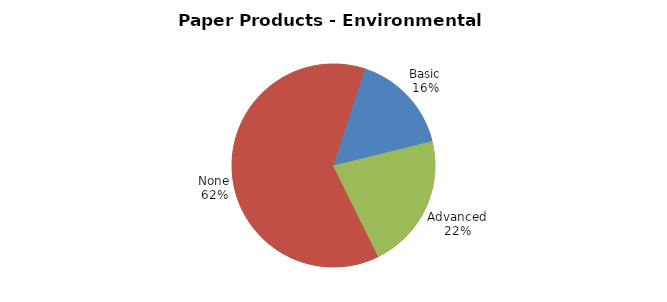
| Category | $2,628,636.64 |
|---|---|
| Basic | 198551.27 |
| Advanced | 264499.5 |
| None | 765534.39 |